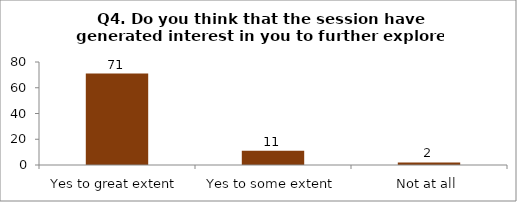
| Category | Q4. Do you think that the session have generated interest in you to further explore the topics? |
|---|---|
| Yes to great extent | 71 |
| Yes to some extent | 11 |
| Not at all | 2 |